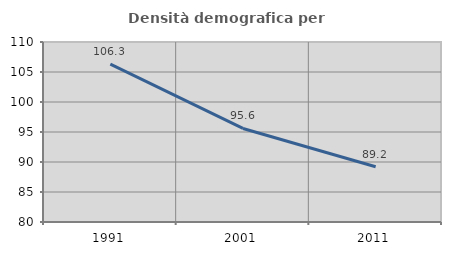
| Category | Densità demografica |
|---|---|
| 1991.0 | 106.325 |
| 2001.0 | 95.591 |
| 2011.0 | 89.207 |